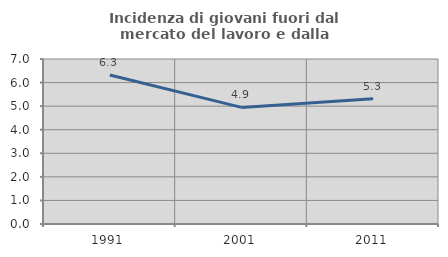
| Category | Incidenza di giovani fuori dal mercato del lavoro e dalla formazione  |
|---|---|
| 1991.0 | 6.322 |
| 2001.0 | 4.947 |
| 2011.0 | 5.314 |